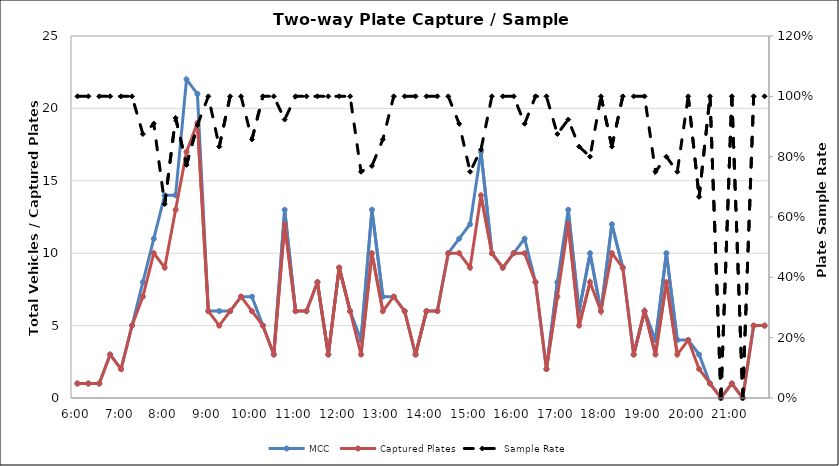
| Category | MCC | Captured Plates |
|---|---|---|
| 0.25 | 1 | 1 |
| 0.260416666666667 | 1 | 1 |
| 0.270833333333333 | 1 | 1 |
| 0.28125 | 3 | 3 |
| 0.291666666666667 | 2 | 2 |
| 0.302083333333333 | 5 | 5 |
| 0.3125 | 8 | 7 |
| 0.322916666666667 | 11 | 10 |
| 0.333333333333333 | 14 | 9 |
| 0.34375 | 14 | 13 |
| 0.354166666666667 | 22 | 17 |
| 0.364583333333333 | 21 | 19 |
| 0.375 | 6 | 6 |
| 0.385416666666667 | 6 | 5 |
| 0.395833333333333 | 6 | 6 |
| 0.40625 | 7 | 7 |
| 0.416666666666667 | 7 | 6 |
| 0.427083333333333 | 5 | 5 |
| 0.4375 | 3 | 3 |
| 0.447916666666667 | 13 | 12 |
| 0.458333333333333 | 6 | 6 |
| 0.46875 | 6 | 6 |
| 0.479166666666667 | 8 | 8 |
| 0.489583333333333 | 3 | 3 |
| 0.5 | 9 | 9 |
| 0.510416666666667 | 6 | 6 |
| 0.520833333333333 | 4 | 3 |
| 0.53125 | 13 | 10 |
| 0.541666666666667 | 7 | 6 |
| 0.552083333333333 | 7 | 7 |
| 0.5625 | 6 | 6 |
| 0.572916666666667 | 3 | 3 |
| 0.583333333333333 | 6 | 6 |
| 0.59375 | 6 | 6 |
| 0.604166666666667 | 10 | 10 |
| 0.614583333333333 | 11 | 10 |
| 0.625 | 12 | 9 |
| 0.635416666666667 | 17 | 14 |
| 0.645833333333333 | 10 | 10 |
| 0.65625 | 9 | 9 |
| 0.666666666666667 | 10 | 10 |
| 0.677083333333333 | 11 | 10 |
| 0.6875 | 8 | 8 |
| 0.697916666666667 | 2 | 2 |
| 0.708333333333333 | 8 | 7 |
| 0.71875 | 13 | 12 |
| 0.729166666666667 | 6 | 5 |
| 0.739583333333333 | 10 | 8 |
| 0.75 | 6 | 6 |
| 0.760416666666667 | 12 | 10 |
| 0.770833333333333 | 9 | 9 |
| 0.78125 | 3 | 3 |
| 0.791666666666667 | 6 | 6 |
| 0.802083333333333 | 4 | 3 |
| 0.8125 | 10 | 8 |
| 0.822916666666667 | 4 | 3 |
| 0.833333333333333 | 4 | 4 |
| 0.84375 | 3 | 2 |
| 0.854166666666667 | 1 | 1 |
| 0.864583333333333 | 0 | 0 |
| 0.875 | 1 | 1 |
| 0.885416666666667 | 0 | 0 |
| 0.895833333333333 | 5 | 5 |
| 0.90625 | 5 | 5 |